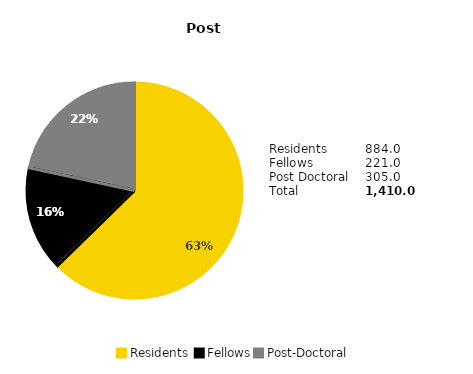
| Category | Series 0 |
|---|---|
| Residents  | 0.627 |
| Fellows | 0.157 |
| Post-Doctoral | 0.216 |